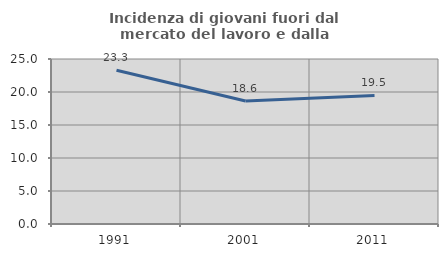
| Category | Incidenza di giovani fuori dal mercato del lavoro e dalla formazione  |
|---|---|
| 1991.0 | 23.3 |
| 2001.0 | 18.638 |
| 2011.0 | 19.481 |